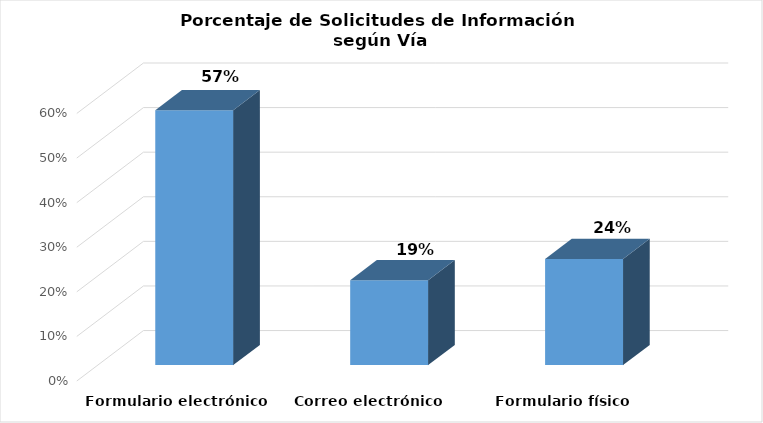
| Category | Series 0 |
|---|---|
| Formulario electrónico SAIP | 0.571 |
| Correo electrónico | 0.19 |
| Formulario físico | 0.238 |